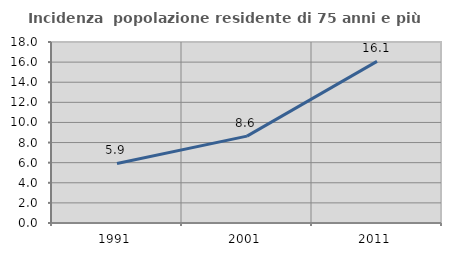
| Category | Incidenza  popolazione residente di 75 anni e più |
|---|---|
| 1991.0 | 5.92 |
| 2001.0 | 8.639 |
| 2011.0 | 16.071 |